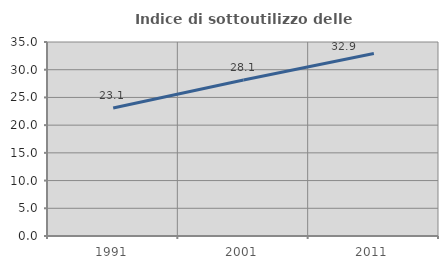
| Category | Indice di sottoutilizzo delle abitazioni  |
|---|---|
| 1991.0 | 23.101 |
| 2001.0 | 28.149 |
| 2011.0 | 32.929 |